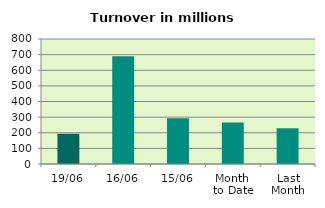
| Category | Series 0 |
|---|---|
| 19/06 | 193.648 |
| 16/06 | 689.072 |
| 15/06 | 292.853 |
| Month 
to Date | 265.413 |
| Last
Month | 228.645 |